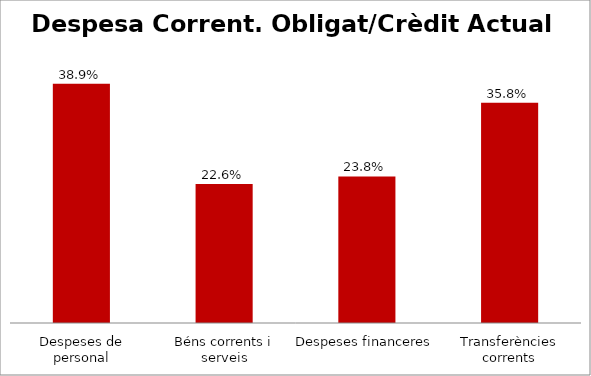
| Category | Series 0 |
|---|---|
| Despeses de personal | 0.389 |
| Béns corrents i serveis | 0.226 |
| Despeses financeres | 0.238 |
| Transferències corrents | 0.358 |